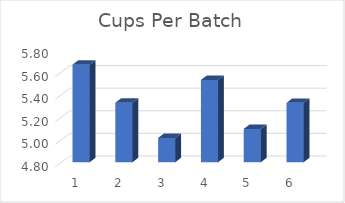
| Category | Series 0 |
|---|---|
| 0 | 5.664 |
| 1 | 5.327 |
| 2 | 5.015 |
| 3 | 5.528 |
| 4 | 5.095 |
| 5 | 5.326 |